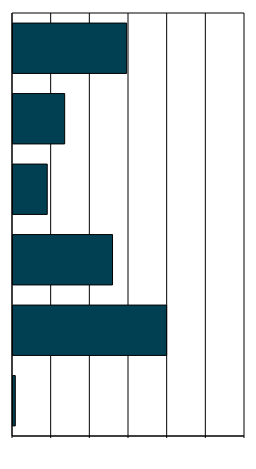
| Category | Series 0 |
|---|---|
| 0 | 1.192 |
| 1 | 79.47 |
| 2 | 51.477 |
| 3 | 17.709 |
| 4 | 26.733 |
| 5 | 58.777 |